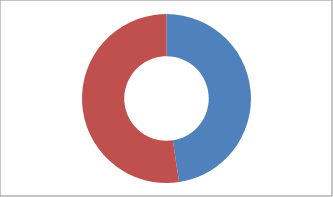
| Category | Series 0 |
|---|---|
| CREDIT CARDS | 50 |
| LOANS | 55 |